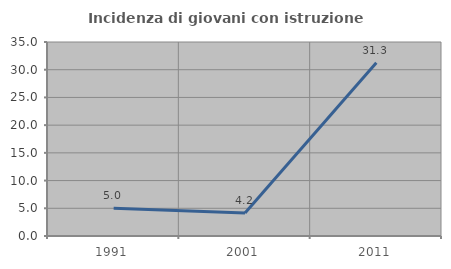
| Category | Incidenza di giovani con istruzione universitaria |
|---|---|
| 1991.0 | 5 |
| 2001.0 | 4.167 |
| 2011.0 | 31.25 |